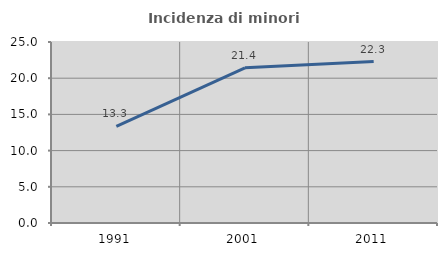
| Category | Incidenza di minori stranieri |
|---|---|
| 1991.0 | 13.333 |
| 2001.0 | 21.429 |
| 2011.0 | 22.302 |